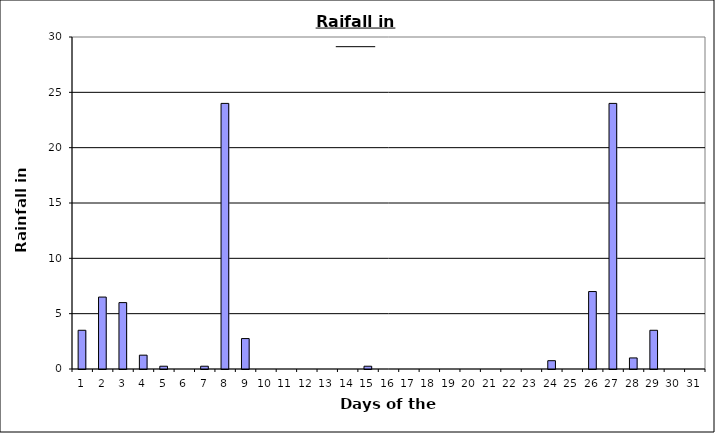
| Category | Series 0 |
|---|---|
| 0 | 3.5 |
| 1 | 6.5 |
| 2 | 6 |
| 3 | 1.25 |
| 4 | 0.25 |
| 5 | 0 |
| 6 | 0.25 |
| 7 | 24 |
| 8 | 2.75 |
| 9 | 0 |
| 10 | 0 |
| 11 | 0 |
| 12 | 0 |
| 13 | 0 |
| 14 | 0.25 |
| 15 | 0 |
| 16 | 0 |
| 17 | 0 |
| 18 | 0 |
| 19 | 0 |
| 20 | 0 |
| 21 | 0 |
| 22 | 0 |
| 23 | 0.75 |
| 24 | 0 |
| 25 | 7 |
| 26 | 24 |
| 27 | 1 |
| 28 | 3.5 |
| 29 | 0 |
| 30 | 0 |